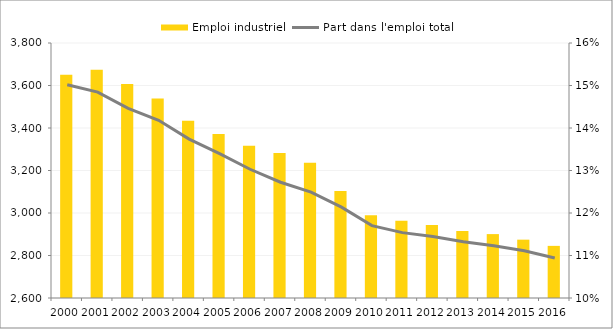
| Category | Emploi industriel |
|---|---|
| 2000.0 | 3650.123 |
| 2001.0 | 3673.842 |
| 2002.0 | 3606.746 |
| 2003.0 | 3538.827 |
| 2004.0 | 3434.308 |
| 2005.0 | 3371.761 |
| 2006.0 | 3316.609 |
| 2007.0 | 3282.257 |
| 2008.0 | 3236.148 |
| 2009.0 | 3103.943 |
| 2010.0 | 2988.887 |
| 2011.0 | 2963.288 |
| 2012.0 | 2943.524 |
| 2013.0 | 2915.423 |
| 2014.0 | 2900.706 |
| 2015.0 | 2874.523 |
| 2016.0 | 2845.285 |